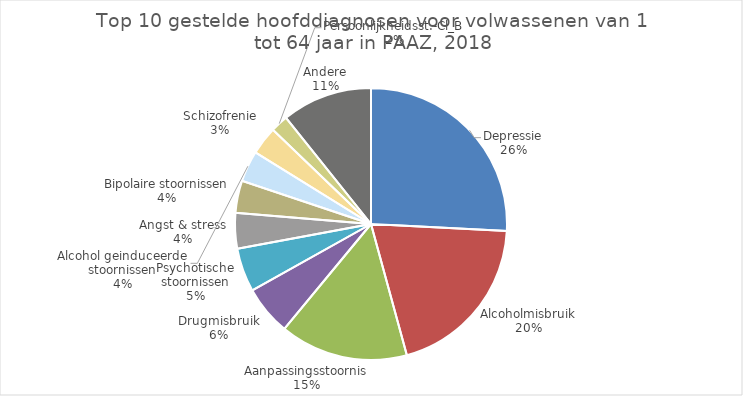
| Category | Series 0 |
|---|---|
| Depressie | 10867 |
| Alcoholmisbruik | 8398 |
| Aanpassingsstoornis | 6419 |
| Drugmisbruik | 2480 |
| Psychotische stoornissen | 2193 |
| Angst & stress | 1776 |
| Bipolaire stoornissen | 1612 |
| Alcohol geinduceerde stoornissen | 1554 |
| Schizofrenie | 1411 |
| Persoonlijkheidsst.-Cl_B | 877 |
| Andere | 4522 |